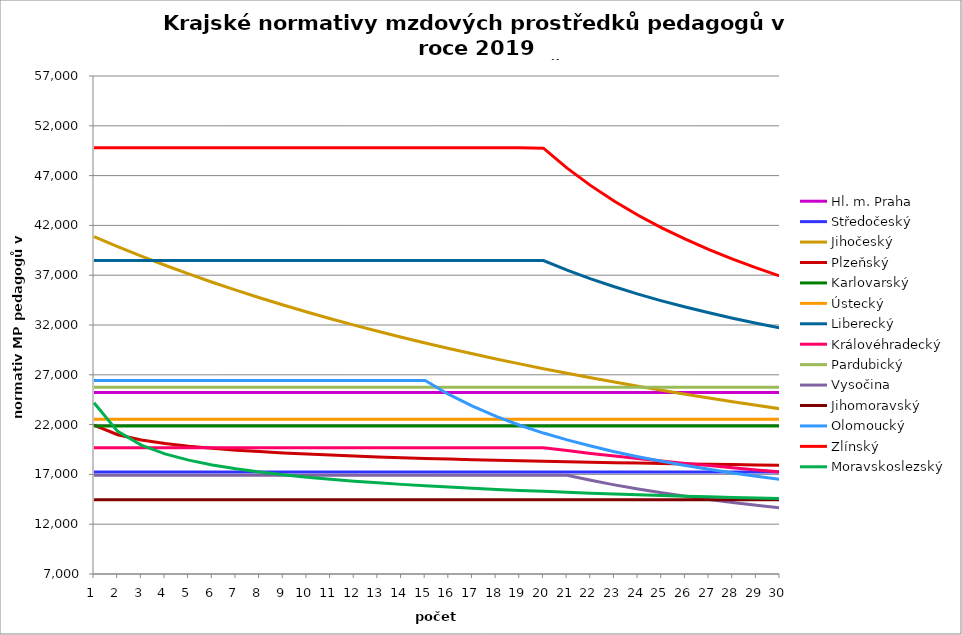
| Category | Hl. m. Praha | Středočeský | Jihočeský | Plzeňský | Karlovarský  | Ústecký   | Liberecký | Královéhradecký | Pardubický | Vysočina | Jihomoravský | Olomoucký | Zlínský | Moravskoslezský |
|---|---|---|---|---|---|---|---|---|---|---|---|---|---|---|
| 0 | 25224.633 | 17234.4 | 40884.054 | 21939.587 | 21866.667 | 22548.82 | 38475.29 | 19679.523 | 25740.36 | 16920.909 | 14447.609 | 26425.263 | 49790.576 | 24191.603 |
| 1 | 25224.633 | 17234.4 | 39875.803 | 20983.274 | 21866.667 | 22548.82 | 38475.29 | 19679.523 | 25740.36 | 16920.909 | 14447.609 | 26425.263 | 49790.576 | 21317.353 |
| 2 | 25224.633 | 17234.4 | 38916.085 | 20454.545 | 21866.667 | 22548.82 | 38475.29 | 19679.523 | 25740.36 | 16920.909 | 14447.609 | 26425.263 | 49790.576 | 19935.673 |
| 3 | 25224.633 | 17234.4 | 38001.477 | 20097.087 | 21866.667 | 22548.82 | 38475.29 | 19679.523 | 25740.36 | 16920.909 | 14447.609 | 26425.263 | 49790.576 | 19062.442 |
| 4 | 25224.633 | 17234.4 | 37128.873 | 19827.586 | 21866.667 | 22548.82 | 38475.29 | 19679.523 | 25740.36 | 16920.909 | 14447.609 | 26425.263 | 49790.576 | 18435.331 |
| 5 | 25224.633 | 17234.4 | 36295.443 | 19620.853 | 21866.667 | 22548.82 | 38475.29 | 19679.523 | 25740.36 | 16920.909 | 14447.609 | 26425.263 | 49790.576 | 17949.978 |
| 6 | 25224.633 | 17234.4 | 35498.607 | 19436.62 | 21866.667 | 22548.82 | 38475.29 | 19679.523 | 25740.36 | 16920.909 | 14447.609 | 26425.263 | 49790.576 | 17557.082 |
| 7 | 25224.633 | 17234.4 | 34736.008 | 19291.705 | 21866.667 | 22548.82 | 38475.29 | 19679.523 | 25740.36 | 16920.909 | 14447.609 | 26425.263 | 49790.576 | 17231.676 |
| 8 | 25224.633 | 17234.4 | 34005.485 | 19157.797 | 21866.667 | 22548.82 | 38475.29 | 19679.523 | 25740.36 | 16920.909 | 14447.609 | 26425.263 | 49790.576 | 16960.199 |
| 9 | 25224.633 | 17234.4 | 33305.056 | 19043.238 | 21866.667 | 22548.82 | 38475.29 | 19679.523 | 25740.36 | 16920.909 | 14447.609 | 26425.263 | 49790.576 | 16717.613 |
| 10 | 25224.633 | 17234.4 | 32632.898 | 18938.701 | 21866.667 | 22548.82 | 38475.29 | 19679.523 | 25740.36 | 16920.909 | 14447.609 | 26425.263 | 49790.576 | 16508.475 |
| 11 | 25224.633 | 17234.4 | 31987.335 | 18843.878 | 21866.667 | 22548.82 | 38475.29 | 19679.523 | 25740.36 | 16920.909 | 14447.609 | 26425.263 | 49790.576 | 16317.511 |
| 12 | 25224.633 | 17234.4 | 31366.818 | 18758.496 | 21866.667 | 22548.82 | 38475.29 | 19679.523 | 25740.36 | 16920.909 | 14447.609 | 26425.263 | 49790.576 | 16150.02 |
| 13 | 25224.633 | 17234.4 | 30769.917 | 18682.31 | 21866.667 | 22548.82 | 38475.29 | 19679.523 | 25740.36 | 16920.909 | 14447.609 | 26425.263 | 49790.576 | 15998.436 |
| 14 | 25224.633 | 17234.4 | 30195.31 | 18606.742 | 21866.667 | 22548.82 | 38475.29 | 19679.523 | 25740.36 | 16920.909 | 14447.609 | 26425.263 | 49790.576 | 15855.814 |
| 15 | 25224.633 | 17234.4 | 29641.77 | 18540.081 | 21866.667 | 22548.82 | 38475.29 | 19679.523 | 25740.36 | 16920.909 | 14447.609 | 25025.794 | 49790.576 | 15727.797 |
| 16 | 25224.633 | 17234.4 | 29108.16 | 18482.143 | 21866.667 | 22548.82 | 38475.29 | 19679.523 | 25740.36 | 16920.909 | 14447.609 | 23851.781 | 49790.576 | 15607.783 |
| 17 | 25224.633 | 17234.4 | 28593.423 | 18424.566 | 21866.667 | 22548.82 | 38475.29 | 19679.523 | 25740.36 | 16920.909 | 14447.609 | 22821.818 | 49790.576 | 15495.455 |
| 18 | 25224.633 | 17234.4 | 28096.573 | 18367.347 | 21866.667 | 22548.82 | 38475.29 | 19679.523 | 25740.36 | 16920.909 | 14447.609 | 21936.865 | 49790.576 | 15390.519 |
| 19 | 25224.633 | 17234.4 | 27616.696 | 18310.482 | 21866.667 | 22548.82 | 38475.29 | 19679.523 | 25740.36 | 16920.909 | 14447.609 | 21151.343 | 49751.424 | 15298.429 |
| 20 | 25224.633 | 17234.4 | 27152.935 | 18262.02 | 21866.667 | 22548.82 | 37510.962 | 19390.402 | 25740.36 | 16920.909 | 14447.609 | 20461.742 | 47753.081 | 15207.435 |
| 21 | 25224.633 | 17234.4 | 26704.493 | 18221.831 | 21866.667 | 22548.82 | 36635.47 | 19109.653 | 25740.36 | 16408.134 | 14447.609 | 19845.059 | 45991.707 | 15117.517 |
| 22 | 25224.633 | 17234.4 | 26270.623 | 18173.837 | 21866.667 | 22548.82 | 35836.251 | 18845.883 | 25740.36 | 15947.039 | 14447.609 | 19282.957 | 44425.909 | 15039.706 |
| 23 | 25224.633 | 17234.4 | 25850.626 | 18134.034 | 21866.667 | 22548.82 | 35103.059 | 18589.296 | 25740.36 | 15528.642 | 14447.609 | 18778.121 | 43023.512 | 14962.692 |
| 24 | 25224.633 | 17234.4 | 25443.846 | 18094.406 | 21866.667 | 22548.82 | 34427.448 | 18348.1 | 25740.36 | 15147.729 | 14447.609 | 18315.732 | 41759.119 | 14886.463 |
| 25 | 25224.633 | 17234.4 | 25049.671 | 18054.95 | 21866.667 | 22548.82 | 33802.39 | 18104.801 | 25740.36 | 14798.825 | 14447.609 | 17899.465 | 40612.401 | 14816.371 |
| 26 | 25224.633 | 17234.4 | 24667.522 | 18015.666 | 21866.667 | 22548.82 | 33221.985 | 17884.011 | 25740.36 | 14477.799 | 14447.609 | 17509.329 | 39566.894 | 14752.254 |
| 27 | 25224.633 | 17234.4 | 24296.857 | 17984.361 | 21866.667 | 22548.82 | 32681.241 | 17660.66 | 25740.36 | 14181.593 | 14447.609 | 17150.47 | 38609.109 | 14688.689 |
| 28 | 25224.633 | 17234.4 | 23937.168 | 17945.384 | 21866.667 | 22548.82 | 32175.904 | 17450.507 | 25740.36 | 13906.621 | 14447.609 | 16820.101 | 37727.892 | 14630.901 |
| 29 | 25224.633 | 17234.4 | 23587.972 | 17914.323 | 21866.667 | 22548.82 | 31702.323 | 17245.296 | 25740.36 | 13651.125 | 14447.609 | 16509.001 | 36913.932 | 14573.566 |